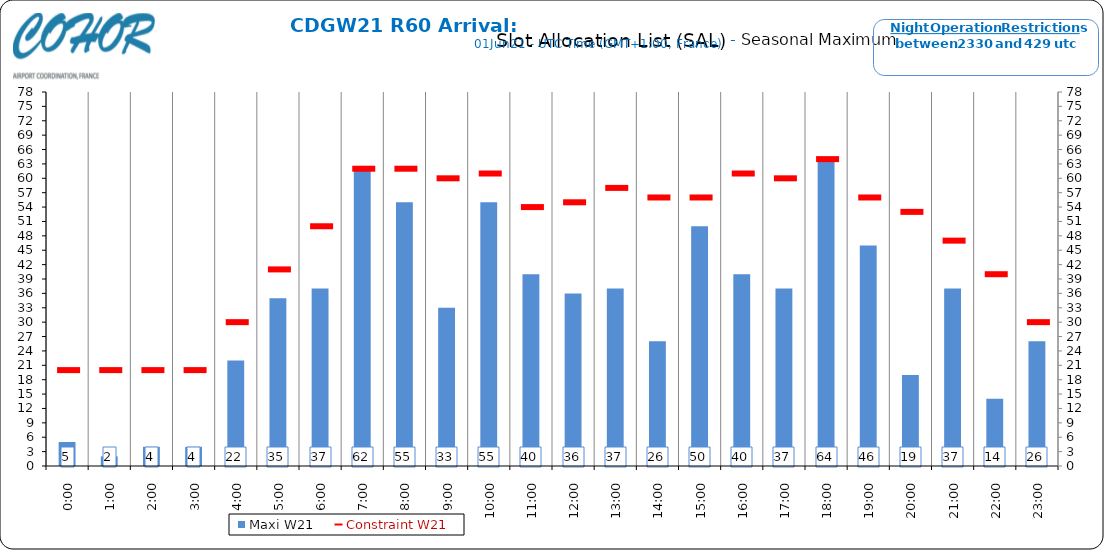
| Category | Maxi W21 |
|---|---|
| 0:00 | 5 |
| 1:00 | 2 |
| 2:00 | 4 |
| 3:00 | 4 |
| 4:00 | 22 |
| 5:00 | 35 |
| 6:00 | 37 |
| 7:00 | 62 |
| 8:00 | 55 |
| 9:00 | 33 |
| 10:00 | 55 |
| 11:00 | 40 |
| 12:00 | 36 |
| 13:00 | 37 |
| 14:00 | 26 |
| 15:00 | 50 |
| 16:00 | 40 |
| 17:00 | 37 |
| 18:00 | 64 |
| 19:00 | 46 |
| 20:00 | 19 |
| 21:00 | 37 |
| 22:00 | 14 |
| 23:00 | 26 |